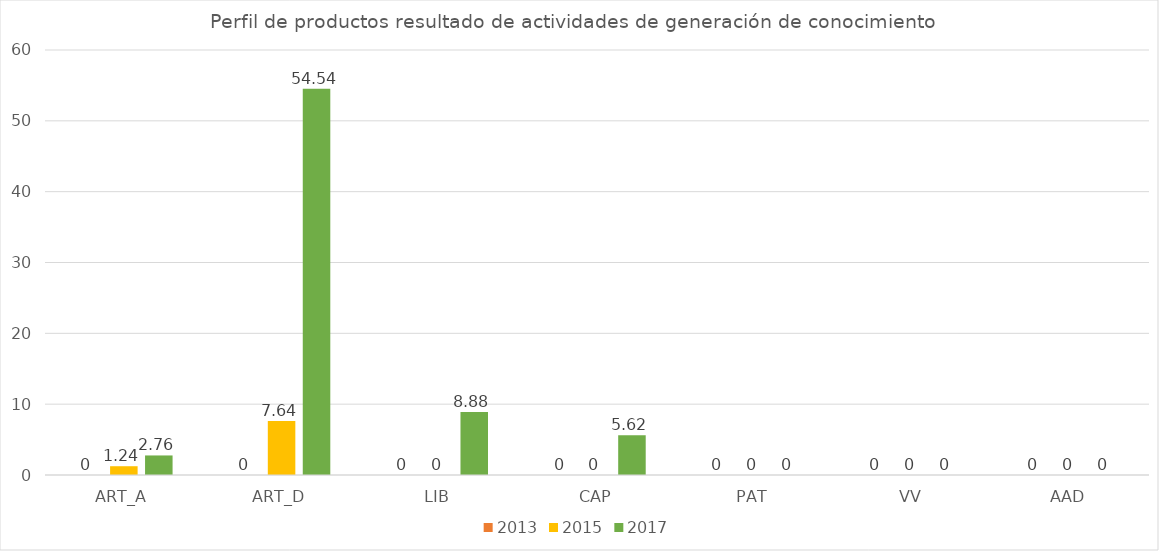
| Category | 2013 | 2015 | 2017 |
|---|---|---|---|
| ART_A | 0 | 1.24 | 2.76 |
| ART_D | 0 | 7.64 | 54.54 |
| LIB | 0 | 0 | 8.88 |
| CAP | 0 | 0 | 5.62 |
| PAT | 0 | 0 | 0 |
| VV | 0 | 0 | 0 |
| AAD | 0 | 0 | 0 |